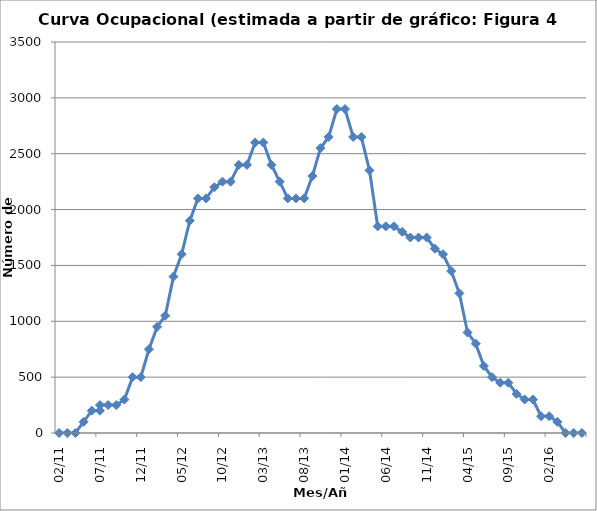
| Category | Series 0 |
|---|---|
| 2011-02-01 | 0 |
| 2011-03-03 | 0 |
| 2011-04-02 | 0 |
| 2011-05-02 | 100 |
| 2011-06-01 | 200 |
| 2011-07-01 | 200 |
| 2011-07-31 | 250 |
| 2011-08-30 | 250 |
| 2011-09-29 | 250 |
| 2011-10-29 | 300 |
| 2011-11-28 | 500 |
| 2011-12-28 | 500 |
| 2012-01-27 | 750 |
| 2012-02-26 | 950 |
| 2012-03-27 | 1050 |
| 2012-04-26 | 1400 |
| 2012-05-26 | 1600 |
| 2012-06-25 | 1900 |
| 2012-07-25 | 2100 |
| 2012-08-24 | 2100 |
| 2012-09-23 | 2200 |
| 2012-10-23 | 2250 |
| 2012-11-22 | 2250 |
| 2012-12-22 | 2400 |
| 2013-01-21 | 2400 |
| 2013-02-20 | 2600 |
| 2013-03-22 | 2600 |
| 2013-04-21 | 2400 |
| 2013-05-21 | 2250 |
| 2013-06-20 | 2100 |
| 2013-07-20 | 2100 |
| 2013-08-19 | 2100 |
| 2013-09-18 | 2300 |
| 2013-10-18 | 2550 |
| 2013-11-17 | 2650 |
| 2013-12-17 | 2900 |
| 2014-01-16 | 2900 |
| 2014-02-15 | 2650 |
| 2014-03-17 | 2650 |
| 2014-04-16 | 2350 |
| 2014-05-16 | 1850 |
| 2014-06-15 | 1850 |
| 2014-07-15 | 1850 |
| 2014-08-14 | 1800 |
| 2014-09-13 | 1750 |
| 2014-10-13 | 1750 |
| 2014-11-12 | 1750 |
| 2014-12-12 | 1650 |
| 2015-01-11 | 1600 |
| 2015-02-10 | 1450 |
| 2015-03-12 | 1250 |
| 2015-04-11 | 900 |
| 2015-05-11 | 800 |
| 2015-06-10 | 600 |
| 2015-07-10 | 500 |
| 2015-08-09 | 450 |
| 2015-09-08 | 450 |
| 2015-10-08 | 350 |
| 2015-11-07 | 300 |
| 2015-12-07 | 300 |
| 2016-01-06 | 150 |
| 2016-02-05 | 150 |
| 2016-03-06 | 100 |
| 2016-04-05 | 0 |
| 2016-05-05 | 0 |
| 2016-06-04 | 0 |